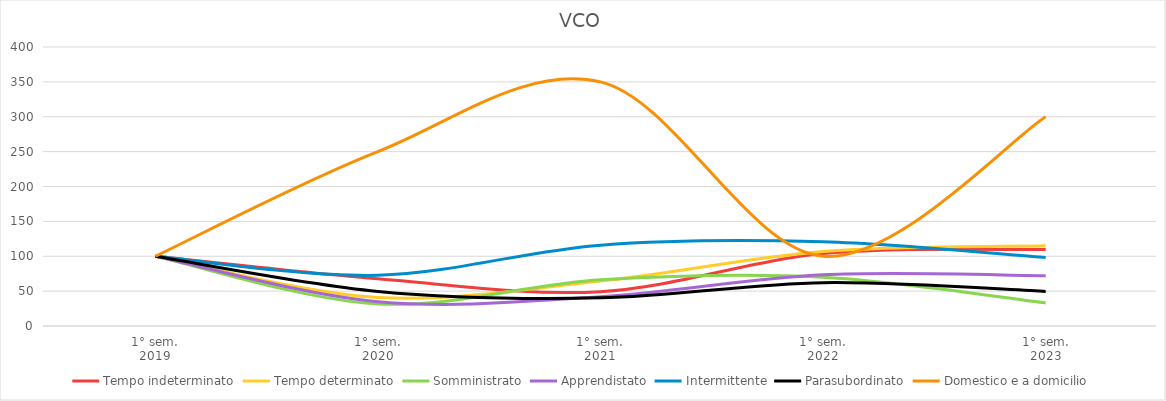
| Category | Tempo indeterminato | Tempo determinato | Somministrato | Apprendistato | Intermittente | Parasubordinato | Domestico e a domicilio |
|---|---|---|---|---|---|---|---|
| 1° sem.
2019 | 100 | 100 | 100 | 100 | 100 | 100 | 100 |
| 1° sem.
2020 | 67.633 | 40.908 | 31.618 | 34.902 | 72.743 | 49.58 | 250 |
| 1° sem.
2021 | 49.275 | 64.388 | 66.176 | 41.961 | 115.928 | 40.336 | 350 |
| 1° sem.
2022 | 103.865 | 106.725 | 69.853 | 73.333 | 120.698 | 62.185 | 100 |
| 1° sem.
2023 | 109.662 | 114.962 | 33.088 | 72.157 | 98.211 | 49.58 | 300 |